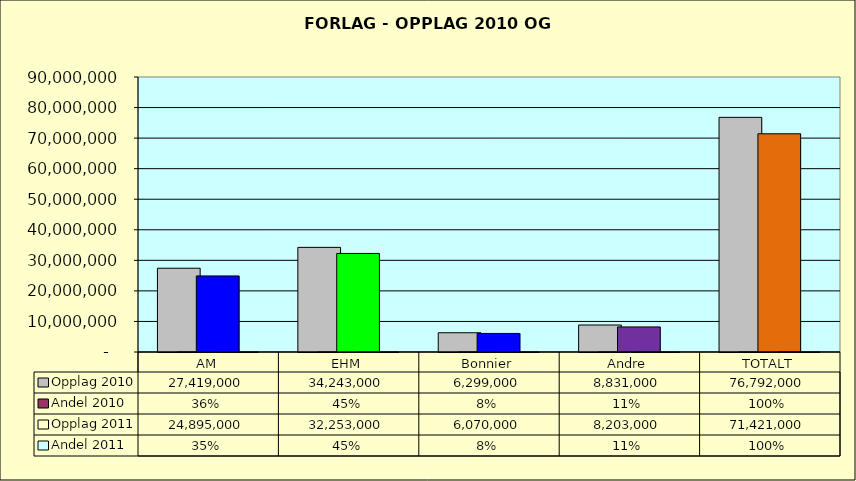
| Category | Opplag 2010 | Andel 2010 | Opplag 2011 | Andel 2011 |
|---|---|---|---|---|
| AM | 27419000 | 0.357 | 24895000 | 0.349 |
| EHM | 34243000 | 0.446 | 32253000 | 0.452 |
| Bonnier | 6299000 | 0.082 | 6070000 | 0.085 |
| Andre | 8831000 | 0.115 | 8203000 | 0.115 |
| TOTALT | 76792000 | 1 | 71421000 | 1 |